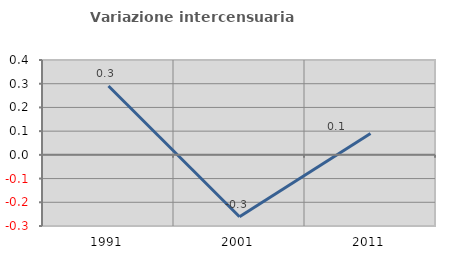
| Category | Variazione intercensuaria annua |
|---|---|
| 1991.0 | 0.29 |
| 2001.0 | -0.261 |
| 2011.0 | 0.09 |